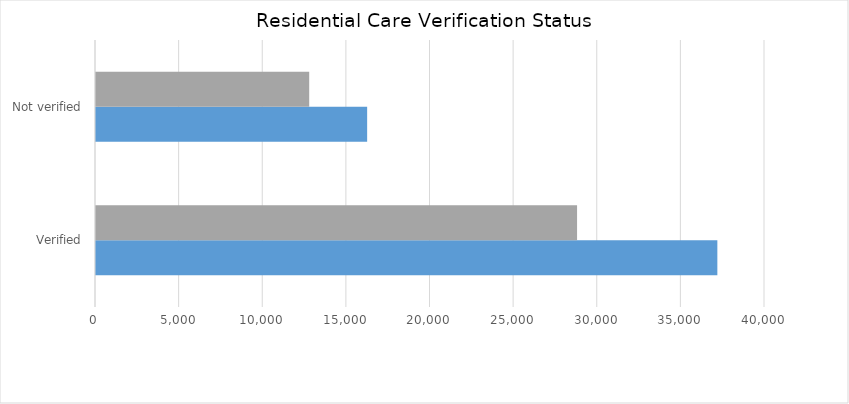
| Category | Residential Care Community 
FFY 2019 | Residential Care Community 
FFY 2020 |
|---|---|---|
| Verified | 37151 | 28763 |
| Not verified | 16212 | 12748 |